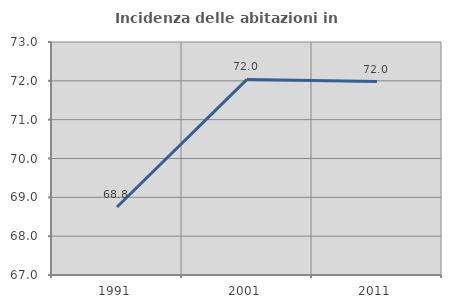
| Category | Incidenza delle abitazioni in proprietà  |
|---|---|
| 1991.0 | 68.75 |
| 2001.0 | 72.037 |
| 2011.0 | 71.981 |